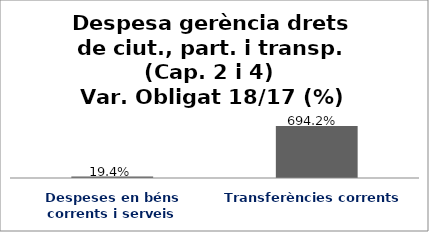
| Category | Series 0 |
|---|---|
| Despeses en béns corrents i serveis | 0.194 |
| Transferències corrents | 6.942 |